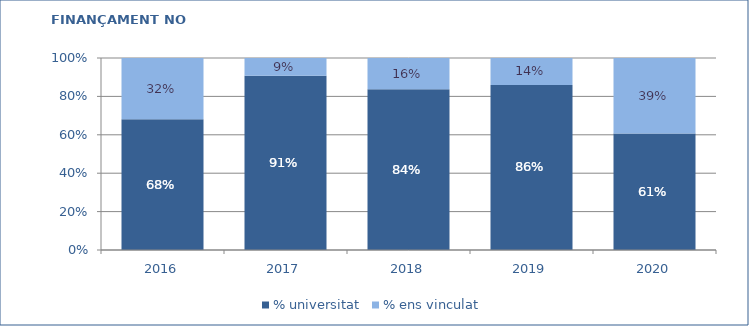
| Category | % universitat | % ens vinculat |
|---|---|---|
| 2016.0 | 0.681 | 0.319 |
| 2017.0 | 0.908 | 0.092 |
| 2018.0 | 0.837 | 0.163 |
| 2019.0 | 0.859 | 0.141 |
| 2020.0 | 0.607 | 0.393 |